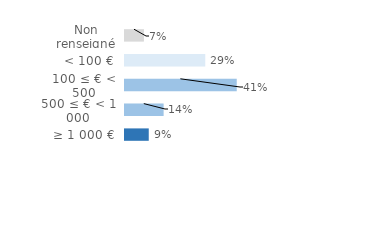
| Category | Series 0 |
|---|---|
| Non renseigné | 0.069 |
| < 100 € | 0.294 |
| 100 ≤ € < 500 | 0.409 |
| 500 ≤ € < 1 000 | 0.141 |
| ≥ 1 000 € | 0.087 |